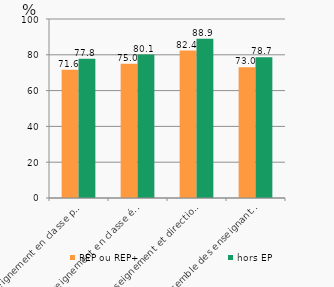
| Category | REP ou REP+  | hors EP |
|---|---|---|
| Enseignement en classe préélémentaire | 71.6 | 77.8 |
| Enseignement en classe élémentaire | 75 | 80.1 |
| Enseignement et direction d'école simultanés | 82.4 | 88.9 |
| Ensemble des enseignants du premier degré public | 73 | 78.7 |